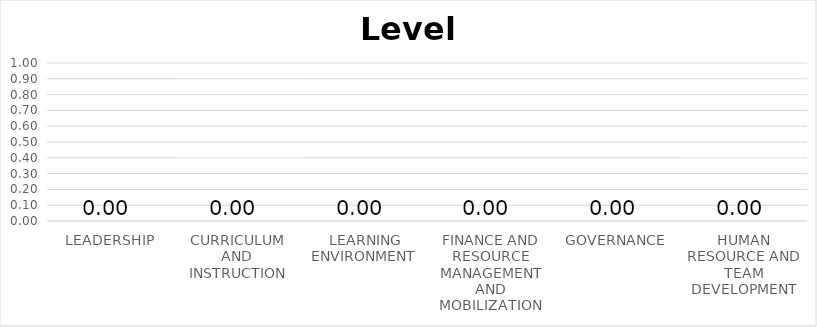
| Category | Series 5 |
|---|---|
| LEADERSHIP | 0 |
| CURRICULUM AND INSTRUCTION | 0 |
|  LEARNING ENVIRONMENT | 0 |
| FINANCE AND RESOURCE MANAGEMENT AND MOBILIZATION | 0 |
| GOVERNANCE | 0 |
| HUMAN RESOURCE AND TEAM DEVELOPMENT | 0 |